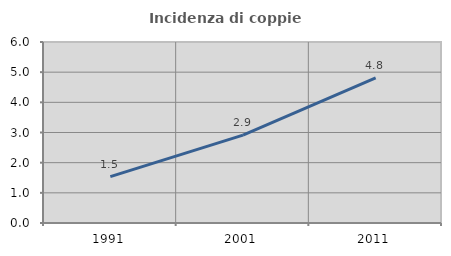
| Category | Incidenza di coppie miste |
|---|---|
| 1991.0 | 1.538 |
| 2001.0 | 2.913 |
| 2011.0 | 4.813 |